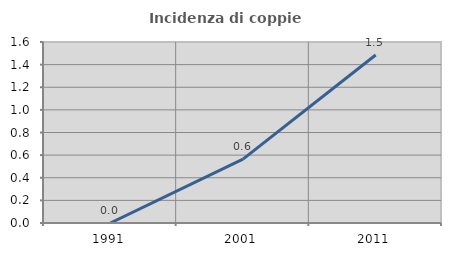
| Category | Incidenza di coppie miste |
|---|---|
| 1991.0 | 0 |
| 2001.0 | 0.565 |
| 2011.0 | 1.485 |